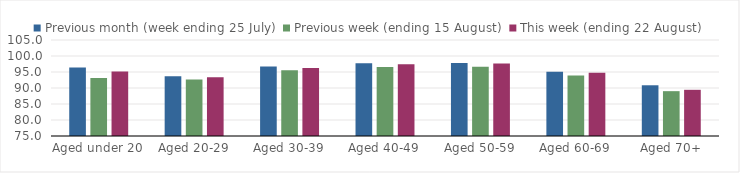
| Category | Previous month (week ending 25 July) | Previous week (ending 15 August) | This week (ending 22 August) |
|---|---|---|---|
| Aged under 20 | 96.434 | 93.153 | 95.15 |
| Aged 20-29 | 93.711 | 92.645 | 93.36 |
| Aged 30-39 | 96.708 | 95.551 | 96.245 |
| Aged 40-49 | 97.725 | 96.532 | 97.427 |
| Aged 50-59 | 97.789 | 96.661 | 97.659 |
| Aged 60-69 | 95.112 | 93.909 | 94.742 |
| Aged 70+ | 90.853 | 89.012 | 89.434 |